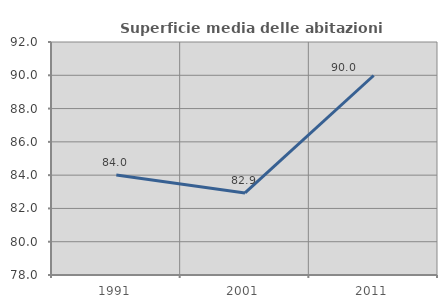
| Category | Superficie media delle abitazioni occupate |
|---|---|
| 1991.0 | 84.003 |
| 2001.0 | 82.933 |
| 2011.0 | 89.987 |